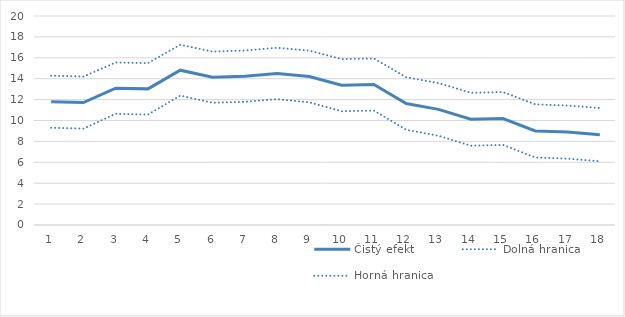
| Category | Čistý efekt | Dolná hranica | Horná hranica |
|---|---|---|---|
| 1.0 | 11.799 | 9.305 | 14.293 |
| 2.0 | 11.715 | 9.226 | 14.203 |
| 3.0 | 13.096 | 10.641 | 15.552 |
| 4.0 | 13.027 | 10.565 | 15.489 |
| 5.0 | 14.815 | 12.38 | 17.251 |
| 6.0 | 14.146 | 11.699 | 16.593 |
| 7.0 | 14.242 | 11.786 | 16.699 |
| 8.0 | 14.504 | 12.045 | 16.963 |
| 9.0 | 14.209 | 11.736 | 16.683 |
| 10.0 | 13.382 | 10.884 | 15.88 |
| 11.0 | 13.444 | 10.954 | 15.935 |
| 12.0 | 11.623 | 9.109 | 14.138 |
| 13.0 | 11.062 | 8.542 | 13.582 |
| 14.0 | 10.121 | 7.589 | 12.654 |
| 15.0 | 10.191 | 7.662 | 12.719 |
| 16.0 | 9.004 | 6.464 | 11.545 |
| 17.0 | 8.89 | 6.35 | 11.43 |
| 18.0 | 8.643 | 6.095 | 11.192 |